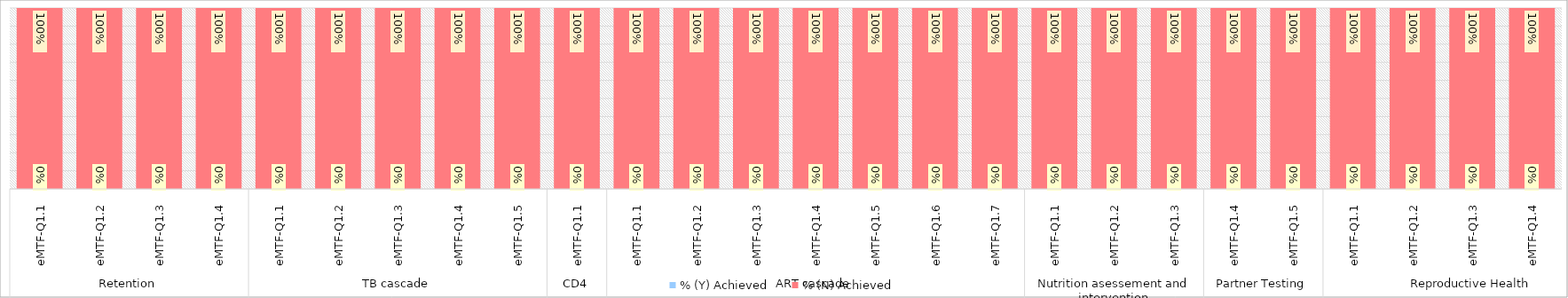
| Category | % (Y) Achieved | % (N) Achieved |
|---|---|---|
| 0 | 0 | 1 |
| 1 | 0 | 1 |
| 2 | 0 | 1 |
| 3 | 0 | 1 |
| 4 | 0 | 1 |
| 5 | 0 | 1 |
| 6 | 0 | 1 |
| 7 | 0 | 1 |
| 8 | 0 | 1 |
| 9 | 0 | 1 |
| 10 | 0 | 1 |
| 11 | 0 | 1 |
| 12 | 0 | 1 |
| 13 | 0 | 1 |
| 14 | 0 | 1 |
| 15 | 0 | 1 |
| 16 | 0 | 1 |
| 17 | 0 | 1 |
| 18 | 0 | 1 |
| 19 | 0 | 1 |
| 20 | 0 | 1 |
| 21 | 0 | 1 |
| 22 | 0 | 1 |
| 23 | 0 | 1 |
| 24 | 0 | 1 |
| 25 | 0 | 1 |